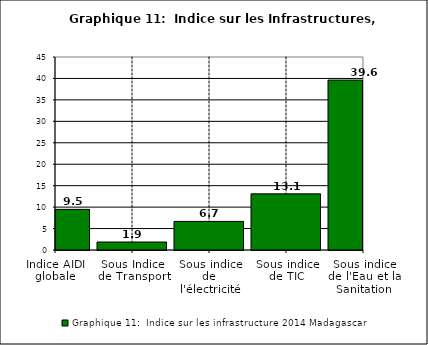
| Category | Graphique 11:  Indice sur les infrastructure 2014 |
|---|---|
| Indice AIDI globale | 9.475 |
| Sous Indice de Transport | 1.859 |
| Sous indice de l'électricité | 6.667 |
| Sous indice de TIC | 13.092 |
| Sous indice de l'Eau et la Sanitation | 39.617 |